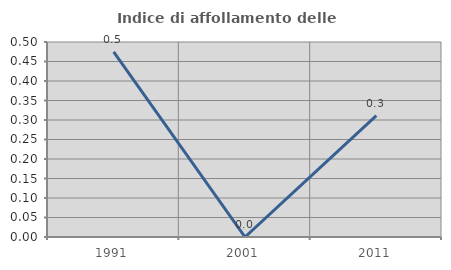
| Category | Indice di affollamento delle abitazioni  |
|---|---|
| 1991.0 | 0.474 |
| 2001.0 | 0 |
| 2011.0 | 0.311 |